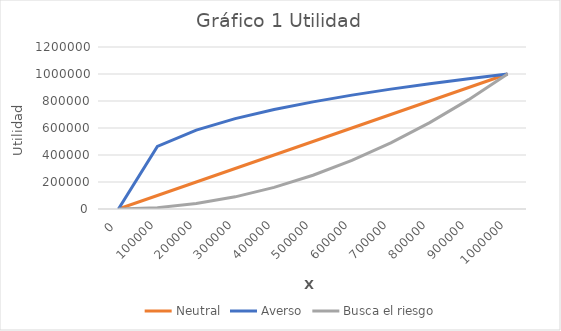
| Category | Neutral | Averso | Busca el riesgo |
|---|---|---|---|
| 0.0 | 0 | 0 | 0 |
| 100000.0 | 100000 | 464158.883 | 10000 |
| 200000.0 | 200000 | 584803.548 | 40000 |
| 300000.0 | 300000 | 669432.95 | 90000 |
| 400000.0 | 400000 | 736806.3 | 160000 |
| 500000.0 | 500000 | 793700.526 | 250000 |
| 600000.0 | 600000 | 843432.665 | 360000 |
| 700000.0 | 700000 | 887904.002 | 490000 |
| 800000.0 | 800000 | 928317.767 | 640000 |
| 900000.0 | 900000 | 965489.385 | 810000 |
| 1000000.0 | 1000000 | 1000000 | 1000000 |